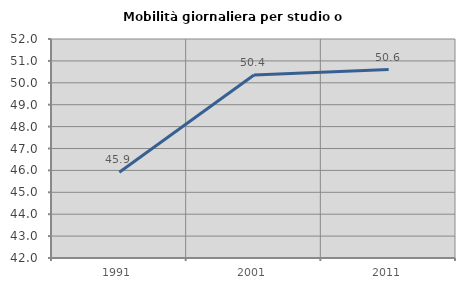
| Category | Mobilità giornaliera per studio o lavoro |
|---|---|
| 1991.0 | 45.916 |
| 2001.0 | 50.355 |
| 2011.0 | 50.607 |